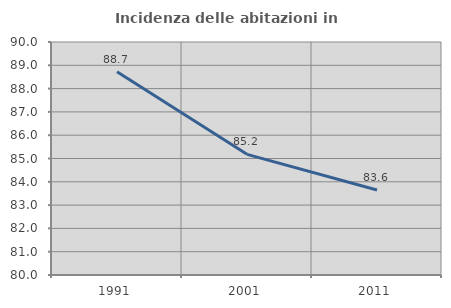
| Category | Incidenza delle abitazioni in proprietà  |
|---|---|
| 1991.0 | 88.72 |
| 2001.0 | 85.178 |
| 2011.0 | 83.649 |